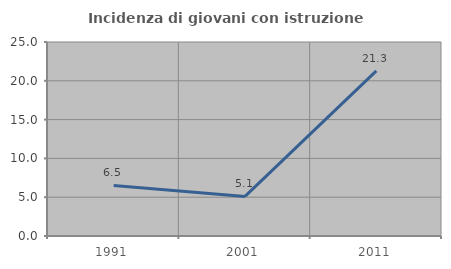
| Category | Incidenza di giovani con istruzione universitaria |
|---|---|
| 1991.0 | 6.522 |
| 2001.0 | 5.102 |
| 2011.0 | 21.277 |